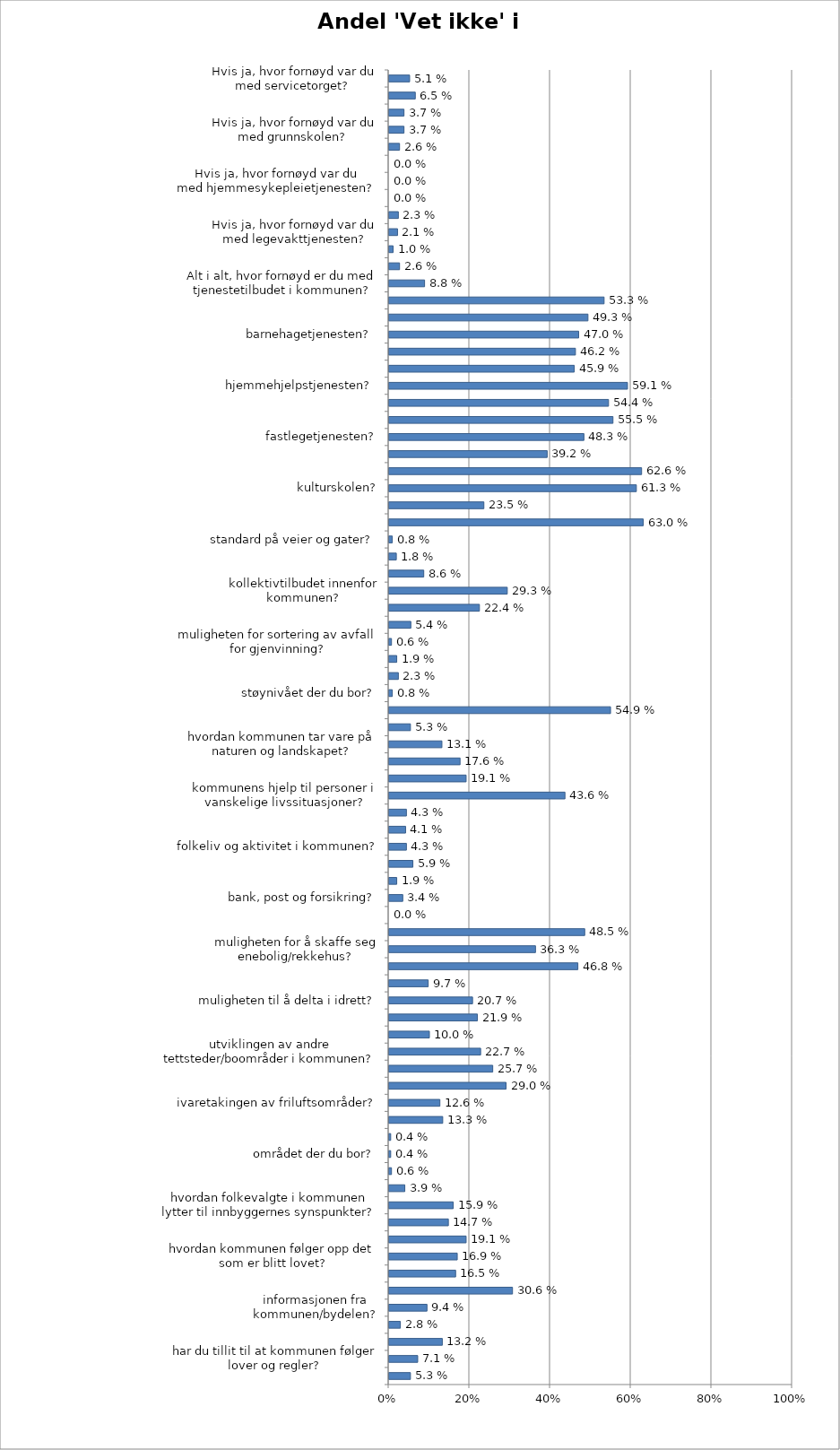
| Category | 0 (Vet ikke) |
|---|---|
| Hvis ja, hvor fornøyd var du med servicetorget?  | 0.051 |
| Hvis ja, hvor fornøyd var du med de internettbaserte tjenestene?  | 0.065 |
| Hvis ja, hvor fornøyd var du med barnehagetjenesten?  | 0.037 |
| Hvis ja, hvor fornøyd var du med grunnskolen?  | 0.037 |
| Hvis ja, hvor fornøyd var du med fritidstilbudet til ungdom?  | 0.026 |
| Hvis ja, hvor fornøyd var du med hjemmehjelpstjenesten?  | 0 |
| Hvis ja, hvor fornøyd var du med hjemmesykepleietjenesten?  | 0 |
| Hvis ja, hvor fornøyd var du med heldøgns omsorgstjeneste/sykehjemtjenesten? | 0 |
| Hvis ja, hvor fornøyd var du med fastlegetjenesten? | 0.023 |
| Hvis ja, hvor fornøyd var du med legevakttjenesten? | 0.021 |
| Hvis ja, hvor fornøyd er du med bibliotek/bokbussen? | 0.01 |
| Hvis ja, hvor fornøyd var du med kulturskolen? | 0.026 |
| Alt i alt, hvor fornøyd er du med tjenestetilbudet i kommunen? | 0.088 |
|  servicetorget?  | 0.533 |
| de internettbaserte tjenestene?  | 0.493 |
| barnehagetjenesten?  | 0.47 |
|  grunnskolen?  | 0.462 |
|  fritidstilbudet til ungdom?  | 0.459 |
|  hjemmehjelpstjenesten?  | 0.591 |
|  hjemmesykepleietjenesten? | 0.544 |
|  heldøgns omsorgstjeneste/sykehjemtjenesten? | 0.555 |
|  fastlegetjenesten? | 0.483 |
|  legevakttjenesten? | 0.392 |
| bibliotek/bokbussen? | 0.626 |
| kulturskolen? | 0.613 |
| muligheter til å få arbeid innen rimelig avstand fra hjemmet? | 0.235 |
| muligheter til å etablere egen virksomhet i din kommune? | 0.63 |
| standard på veier og gater? | 0.008 |
| tilrettelegging for fotgjengere? | 0.018 |
| tilrettelegging for syklister? | 0.086 |
| kollektivtilbudet innenfor kommunen? | 0.293 |
| kollektivtilbudet inn og ut av kommunen? | 0.224 |
| kvaliteten på drikkevannet? | 0.054 |
| muligheten for sortering av avfall for gjenvinning? | 0.006 |
| henting av husholdningsavfall? | 0.019 |
| luftkvaliteten? | 0.023 |
| støynivået der du bor? | 0.008 |
| kommunens innsats for å møte klimautfordringene? | 0.549 |
| tilrettelegging for friluftsliv? | 0.053 |
| hvordan kommunen tar vare på naturen og landskapet? | 0.131 |
| oppvekstmiljøet for barn og unge? | 0.176 |
| kommunen som bosted for eldre? | 0.191 |
| kommunens hjelp til personer i vanskelige livssituasjoner? | 0.436 |
| naboskap og sosialt fellesskap? | 0.043 |
| møteplasser der du kan treffe andre? | 0.041 |
| folkeliv og aktivitet i kommunen? | 0.043 |
| ryddighet og renhold på offentlige steder? | 0.059 |
| tilbudet av kafeer, restauranter, uteliv? | 0.019 |
| bank, post og forsikring? | 0.034 |
| butikktilbudet? | 0 |
| muligheten for å skaffe seg leilighet? | 0.485 |
| muligheten for å skaffe seg enebolig/rekkehus? | 0.363 |
| muligheten for å skaffe seg tomt? | 0.468 |
| kulturtilbudet i kommunen? | 0.097 |
| muligheten til å delta i idrett? | 0.207 |
| andre fritidsaktiviteter? | 0.219 |
| utviklingen av kommunesenteret? | 0.1 |
| utviklingen av andre tettsteder/boområder i kommunen? | 0.227 |
| næringsutviklingen? | 0.257 |
| bevaringen av dyrket mark? | 0.29 |
| ivaretakingen av friluftsområder? | 0.126 |
| leke- og aktivitetsområder? | 0.133 |
| Hvor trygt opplever du at det er å bo og ferdes i din kommune? | 0.004 |
| området der du bor? | 0.004 |
| å bo i kommunen? | 0.006 |
| I hvilken grad vil du anbefale dine venner og bekjente å flytte til din kommune? | 0.039 |
| hvordan folkevalgte i kommunen lytter til innbyggernes synspunkter? | 0.159 |
| hvordan folkevalgte i kommunen løser lokale utfordringer? | 0.147 |
| muligheten for å påvirke kommunale beslutninger? | 0.191 |
| hvordan kommunen følger opp det som er blitt lovet? | 0.169 |
| serviceinnstillingen hos de ansatte i kommunen? | 0.165 |
| hvor raskt du får hjelp/svar på dine spørsmål? | 0.306 |
| informasjonen fra kommunen/bydelen? | 0.094 |
| har du tillit til at politikerne i kommunen arbeider for befolkningens beste? | 0.028 |
| har du tillit til at kommunen behandler like saker likt? | 0.132 |
| har du tillit til at kommunen følger lover og regler? | 0.071 |
| Tror du kommunen din har godt omdømme? | 0.053 |